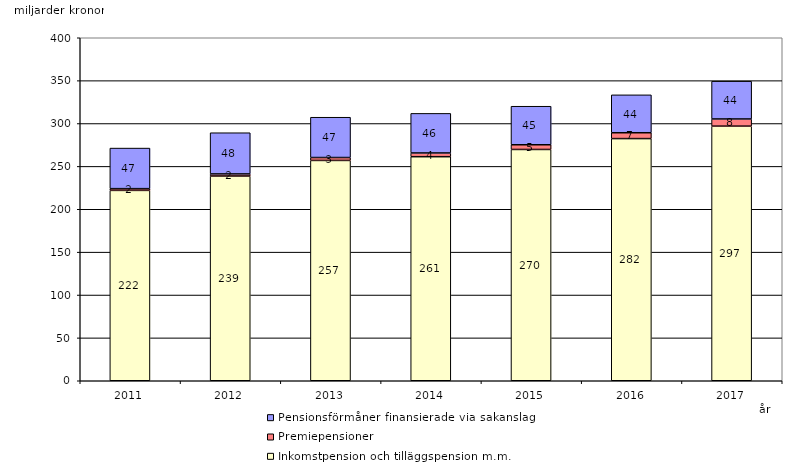
| Category | Inkomstpension och tilläggspension m.m. | Premiepensioner | Pensionsförmåner finansierade via sakanslag |
|---|---|---|---|
| 2011.0 | 222.004 | 2.022 | 47.319 |
| 2012.0 | 238.748 | 2.465 | 48.024 |
| 2013.0 | 256.926 | 3.395 | 47 |
| 2014.0 | 261.287 | 4.354 | 46.166 |
| 2015.0 | 269.716 | 5.489 | 44.933 |
| 2016.0 | 282.406 | 6.809 | 44.217 |
| 2017.0 | 296.929 | 8.372 | 44.057 |